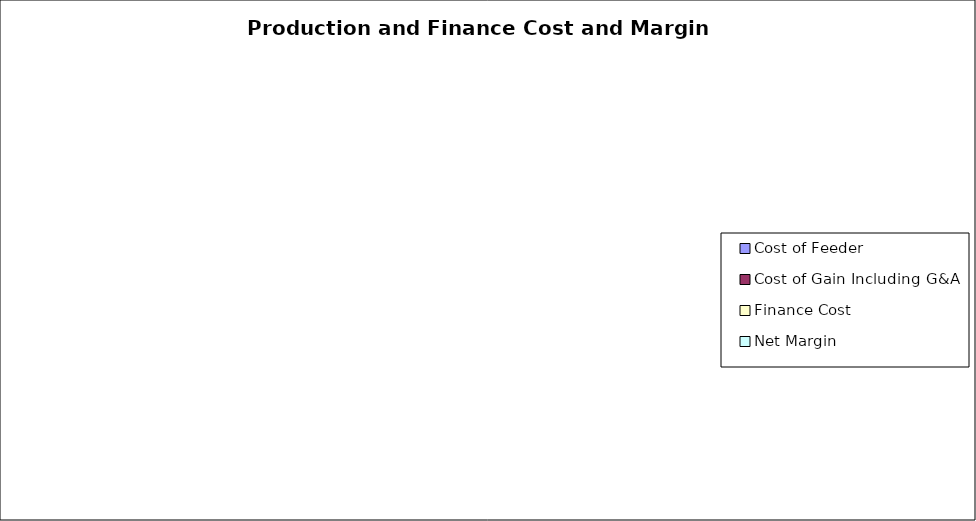
| Category | $/Head |
|---|---|
| Cost of Feeder | 0 |
| Cost of Gain Including G&A | 0 |
| Finance Cost | 0 |
| Net Margin | 0 |